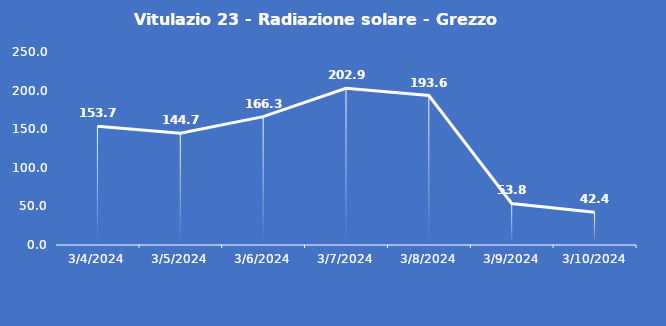
| Category | Vitulazio 23 - Radiazione solare - Grezzo (W/m2) |
|---|---|
| 3/4/24 | 153.7 |
| 3/5/24 | 144.7 |
| 3/6/24 | 166.3 |
| 3/7/24 | 202.9 |
| 3/8/24 | 193.6 |
| 3/9/24 | 53.8 |
| 3/10/24 | 42.4 |